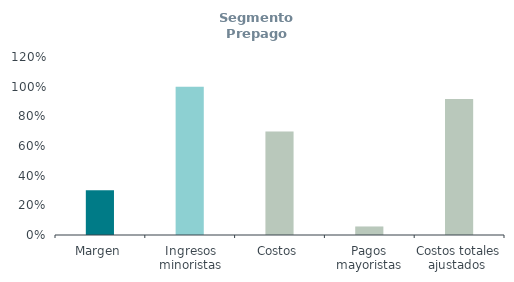
| Category | Segmento Prepago
(% ingresos) |
|---|---|
| Margen | 0.302 |
| Ingresos minoristas | 1 |
| Costos | 0.698 |
| Pagos mayoristas | 0.058 |
| Costos totales ajustados  | 0.918 |